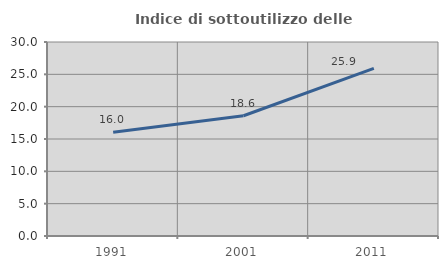
| Category | Indice di sottoutilizzo delle abitazioni  |
|---|---|
| 1991.0 | 16.04 |
| 2001.0 | 18.6 |
| 2011.0 | 25.933 |